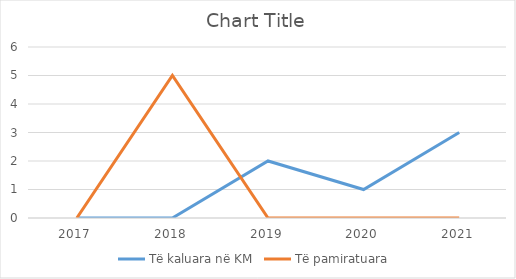
| Category | Të kaluara në KM | Të pamiratuara  |
|---|---|---|
| 2017.0 | 0 | 0 |
| 2018.0 | 0 | 5 |
| 2019.0 | 2 | 0 |
| 2020.0 | 1 | 0 |
| 2021.0 | 3 | 0 |